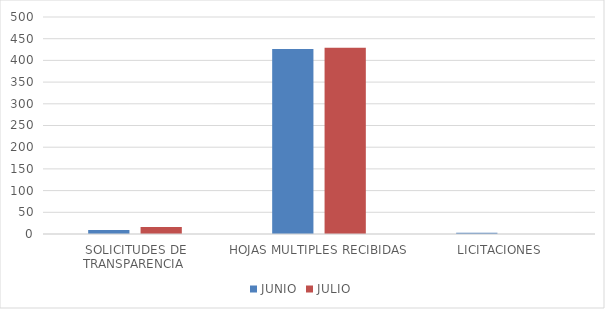
| Category | JUNIO | JULIO |
|---|---|---|
| SOLICITUDES DE TRANSPARENCIA  | 9 | 16 |
| HOJAS MULTIPLES RECIBIDAS | 426 | 429 |
| LICITACIONES  | 3 | 0 |